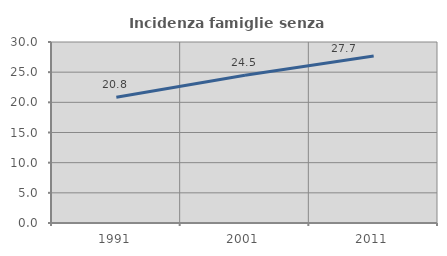
| Category | Incidenza famiglie senza nuclei |
|---|---|
| 1991.0 | 20.83 |
| 2001.0 | 24.48 |
| 2011.0 | 27.694 |